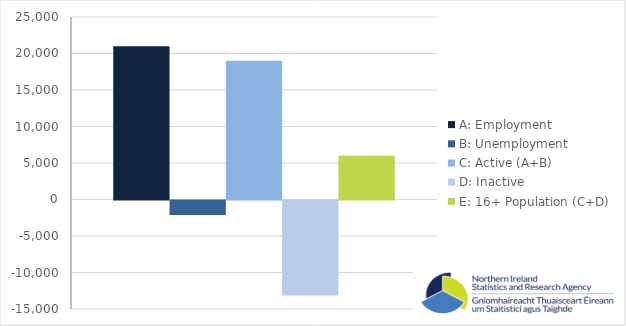
| Category | A: Employment | B: Unemployment | C: Active (A+B) | D: Inactive | E: 16+ Population (C+D) |
|---|---|---|---|---|---|
| 0 | 21000 | -2000 | 19000 | -13000 | 6000 |